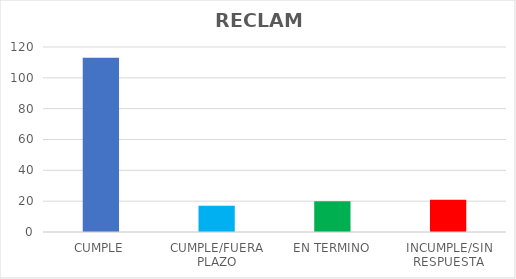
| Category | TOTAL |
|---|---|
| CUMPLE | 113 |
| CUMPLE/FUERA PLAZO | 17 |
| EN TERMINO | 20 |
| INCUMPLE/SIN RESPUESTA | 21 |